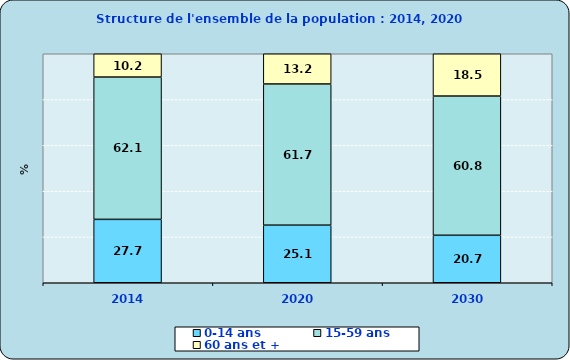
| Category | 0-14 ans  | 15-59 ans | 60 ans et + |
|---|---|---|---|
| 2014.0 | 27.675 | 62.147 | 10.178 |
| 2020.0 | 25.148 | 61.653 | 13.199 |
| 2030.0 | 20.73 | 60.796 | 18.474 |